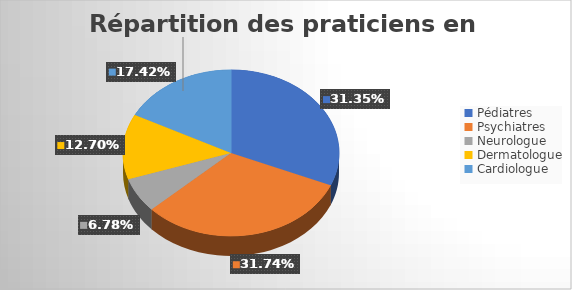
| Category | Series 0 |
|---|---|
| Pédiatres | 0.314 |
| Psychiatres | 0.317 |
| Neurologue | 0.068 |
| Dermatologue | 0.127 |
| Cardiologue | 0.174 |